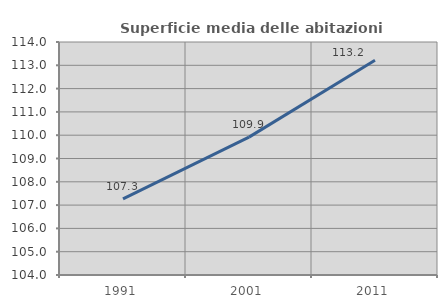
| Category | Superficie media delle abitazioni occupate |
|---|---|
| 1991.0 | 107.267 |
| 2001.0 | 109.917 |
| 2011.0 | 113.217 |